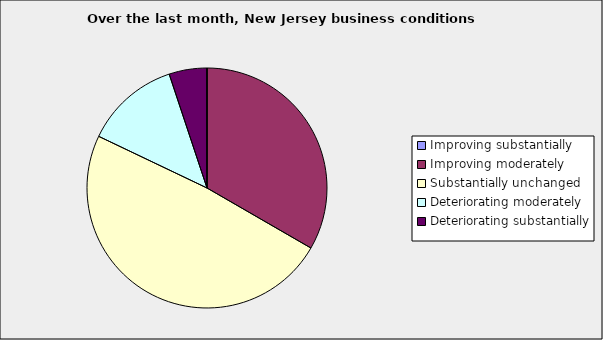
| Category | Series 0 |
|---|---|
| Improving substantially | 0 |
| Improving moderately | 0.333 |
| Substantially unchanged | 0.487 |
| Deteriorating moderately | 0.128 |
| Deteriorating substantially | 0.051 |